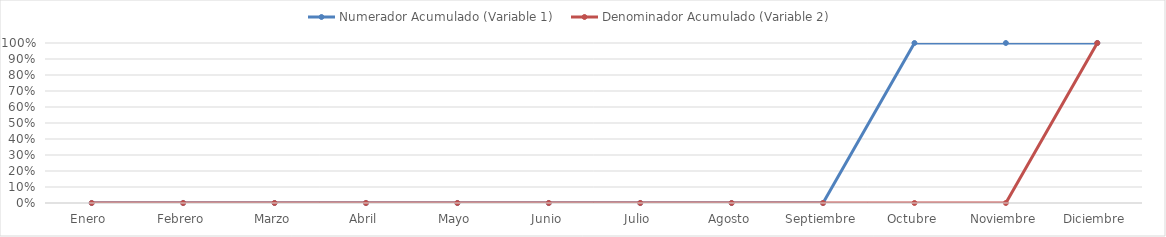
| Category | Numerador Acumulado (Variable 1) | Denominador Acumulado (Variable 2) |
|---|---|---|
| Enero  | 0 | 0 |
| Febrero | 0 | 0 |
| Marzo | 0 | 0 |
| Abril | 0 | 0 |
| Mayo | 0 | 0 |
| Junio | 0 | 0 |
| Julio | 0 | 0 |
| Agosto | 0 | 0 |
| Septiembre | 0 | 0 |
| Octubre | 1 | 0 |
| Noviembre | 1 | 0 |
| Diciembre | 1 | 1 |